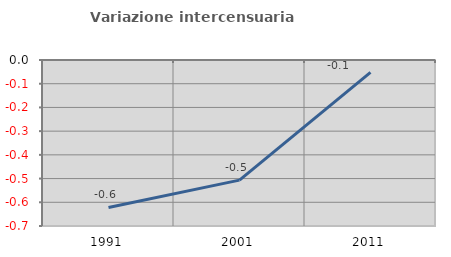
| Category | Variazione intercensuaria annua |
|---|---|
| 1991.0 | -0.622 |
| 2001.0 | -0.506 |
| 2011.0 | -0.052 |